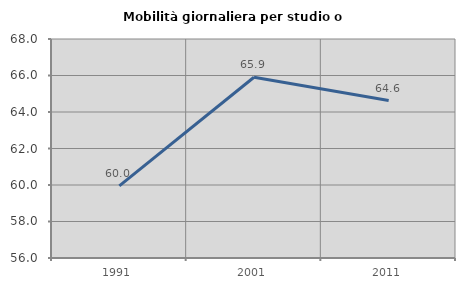
| Category | Mobilità giornaliera per studio o lavoro |
|---|---|
| 1991.0 | 59.953 |
| 2001.0 | 65.903 |
| 2011.0 | 64.629 |